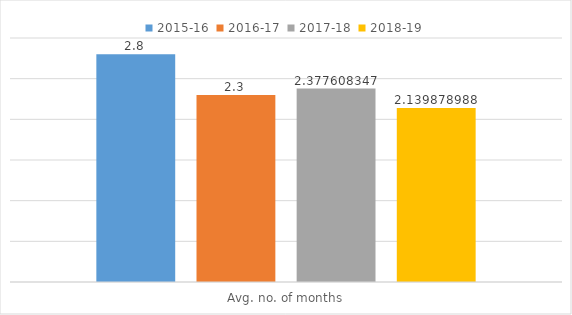
| Category | 2015-16 | 2016-17 | 2017-18 | 2018-19 |
|---|---|---|---|---|
| Avg. no. of months | 2.8 | 2.3 | 2.378 | 2.14 |